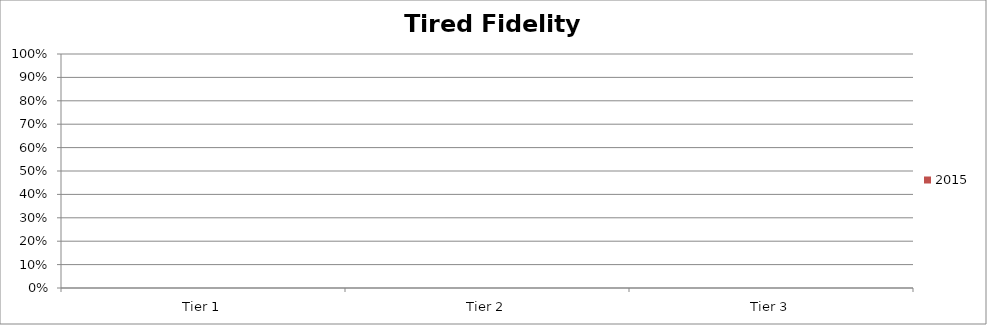
| Category | 2015 |
|---|---|
| Tier 1 | 0 |
| Tier 2 | 0 |
| Tier 3 | 0 |